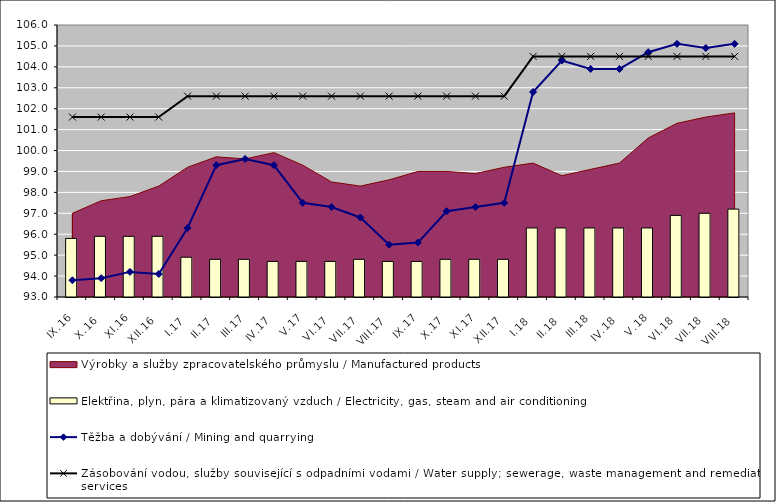
| Category | Elektřina, plyn, pára a klimatizovaný vzduch / Electricity, gas, steam and air conditioning |
|---|---|
| IX.16 | 95.8 |
| X.16 | 95.9 |
| XI.16 | 95.9 |
| XII.16 | 95.9 |
| I.17 | 94.9 |
| II.17 | 94.8 |
| III.17 | 94.8 |
| IV.17 | 94.7 |
| V.17 | 94.7 |
| VI.17 | 94.7 |
| VII.17 | 94.8 |
| VIII.17 | 94.7 |
| IX.17 | 94.7 |
| X.17 | 94.8 |
| XI.17 | 94.8 |
| XII.17 | 94.8 |
| I.18 | 96.3 |
| II.18 | 96.3 |
| III.18 | 96.3 |
| IV.18 | 96.3 |
| V.18 | 96.3 |
| VI.18 | 96.9 |
| VII.18 | 97 |
| VIII.18 | 97.2 |